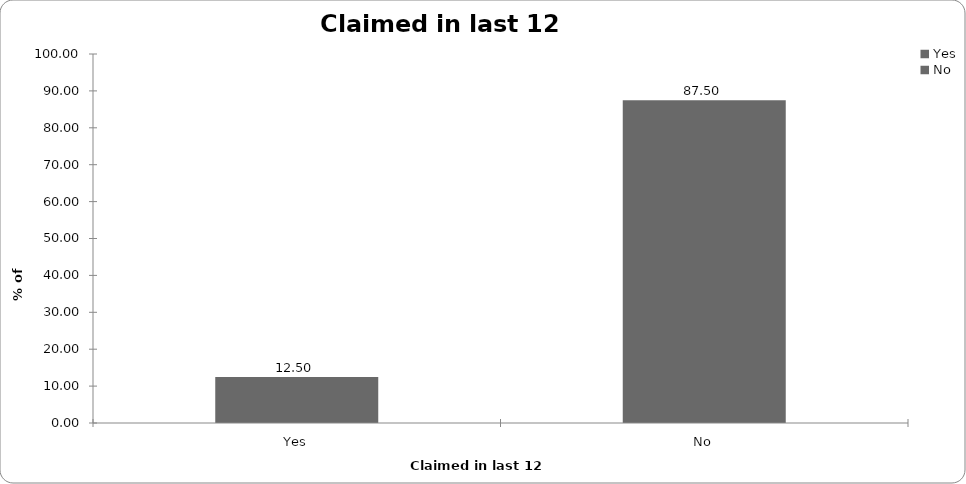
| Category | Claimed in last 12 months |
|---|---|
| Yes | 12.5 |
| No | 87.5 |